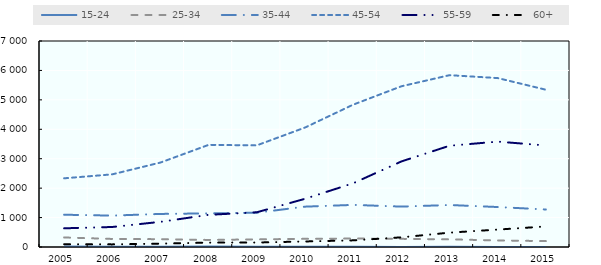
| Category | 15-24 | 25-34 | 35-44 | 45-54 | 55-59 | 60+ |
|---|---|---|---|---|---|---|
| 2005.0 | 15 | 324 | 1097 | 2334 | 635 | 93 |
| 2006.0 | 12 | 274 | 1067 | 2469 | 680 | 89 |
| 2007.0 | 8 | 266 | 1124 | 2870 | 855 | 114 |
| 2008.0 | 13 | 240 | 1142 | 3471 | 1093 | 149 |
| 2009.0 | 5 | 259 | 1165 | 3454 | 1180 | 152 |
| 2010.0 | 6 | 278 | 1371 | 4059 | 1638 | 188 |
| 2011.0 | 7 | 288 | 1431 | 4837 | 2166 | 226 |
| 2012.0 | 3 | 277 | 1373 | 5461 | 2907 | 328 |
| 2013.0 | 5 | 260 | 1427 | 5839 | 3441 | 488 |
| 2014.0 | 3 | 223 | 1358 | 5740 | 3581 | 592 |
| 2015.0 | 2 | 200 | 1275 | 5344 | 3450 | 698 |